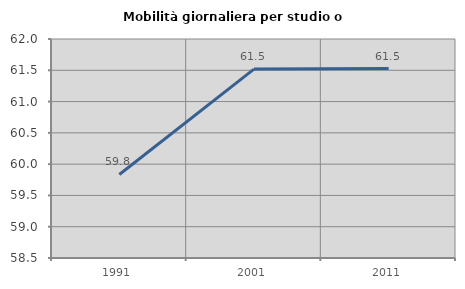
| Category | Mobilità giornaliera per studio o lavoro |
|---|---|
| 1991.0 | 59.835 |
| 2001.0 | 61.519 |
| 2011.0 | 61.528 |